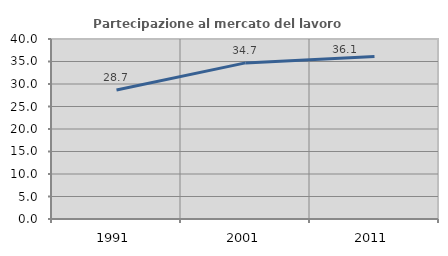
| Category | Partecipazione al mercato del lavoro  femminile |
|---|---|
| 1991.0 | 28.669 |
| 2001.0 | 34.689 |
| 2011.0 | 36.132 |